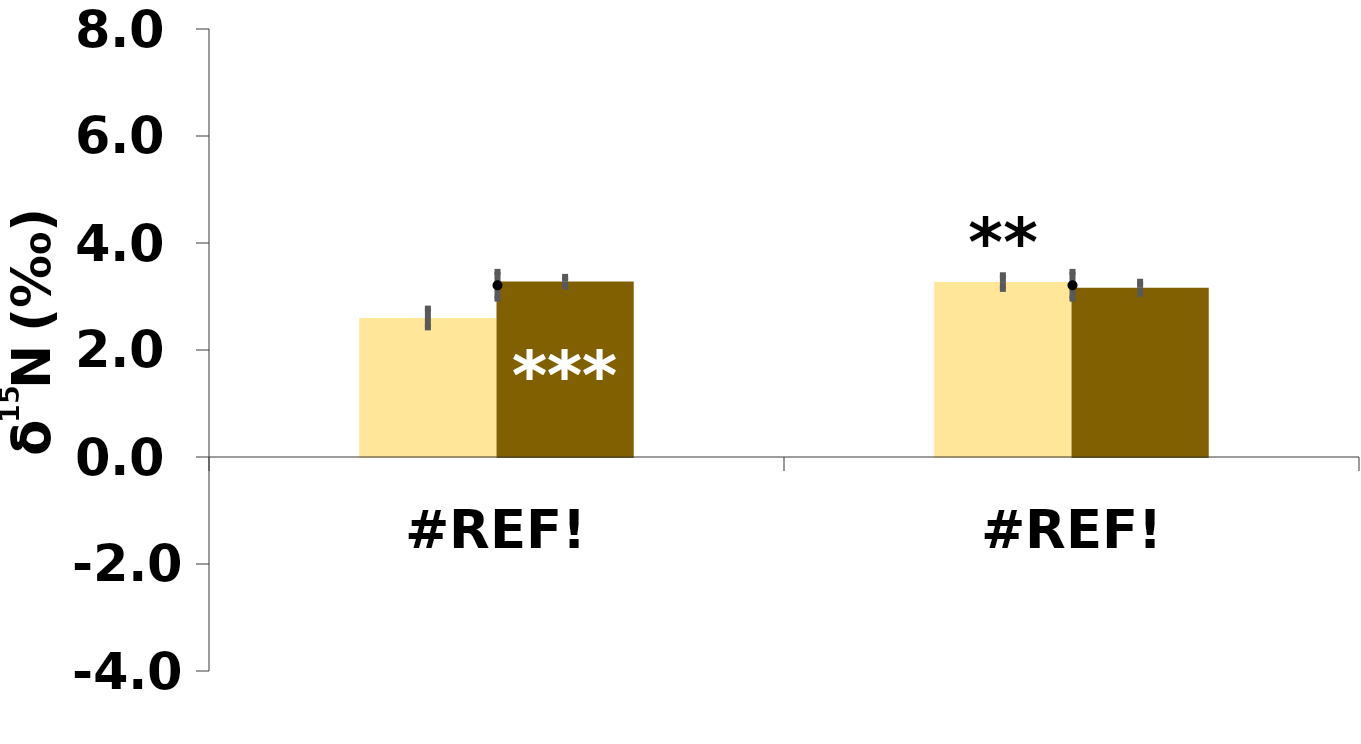
| Category | Root | Shoot |
|---|---|---|
| 0.0 | 2.598 | 3.278 |
| 0.0 | 3.27 | 3.162 |